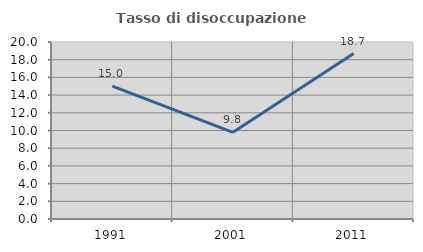
| Category | Tasso di disoccupazione giovanile  |
|---|---|
| 1991.0 | 15.023 |
| 2001.0 | 9.79 |
| 2011.0 | 18.692 |